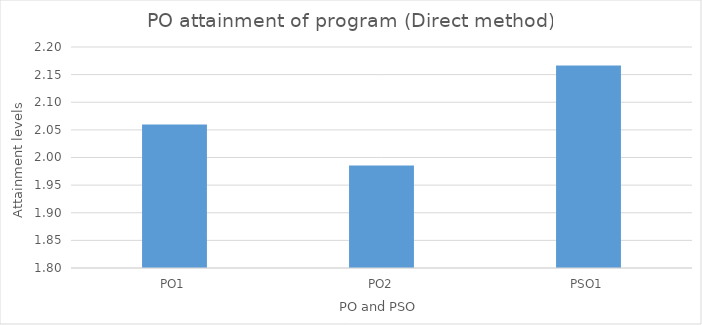
| Category | 2.06 |
|---|---|
| PO1 | 2.06 |
| PO2 | 1.986 |
| PSO1 | 2.167 |